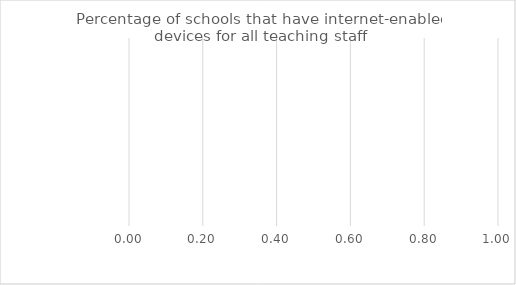
| Category | Benchmark | Entire LEA  | Title IV-A Identified Schools |
|---|---|---|---|
| Percentage of schools that have internet-enabled devices for all teaching staff | 0 | 0 | 0 |